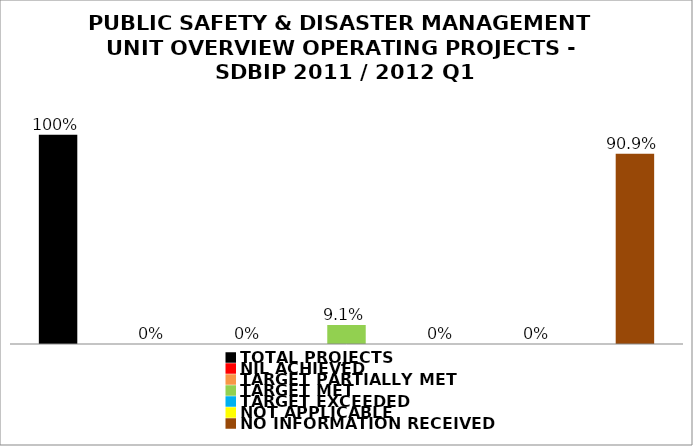
| Category | Series 0 |
|---|---|
| TOTAL PROJECTS | 1 |
| NIL ACHIEVED | 0 |
| TARGET PARTIALLY MET | 0 |
| TARGET MET | 0.091 |
| TARGET EXCEEDED | 0 |
| NOT APPLICABLE | 0 |
| NO INFORMATION RECEIVED | 0.909 |